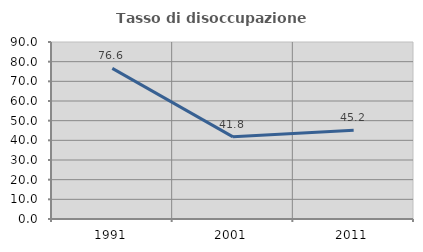
| Category | Tasso di disoccupazione giovanile  |
|---|---|
| 1991.0 | 76.562 |
| 2001.0 | 41.772 |
| 2011.0 | 45.161 |